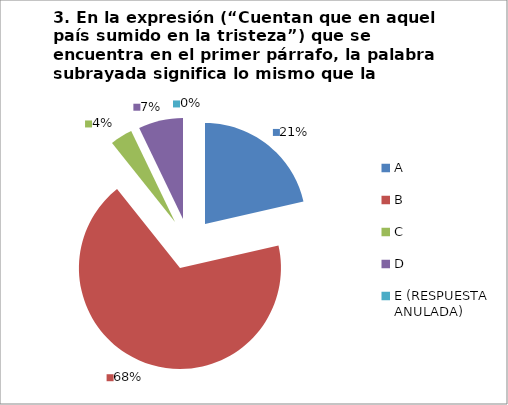
| Category | CANTIDAD DE RESPUESTAS PREGUNTA (3) | PORCENTAJE |
|---|---|---|
| A | 6 | 0.214 |
| B | 19 | 0.679 |
| C | 1 | 0.036 |
| D | 2 | 0.071 |
| E (RESPUESTA ANULADA) | 0 | 0 |